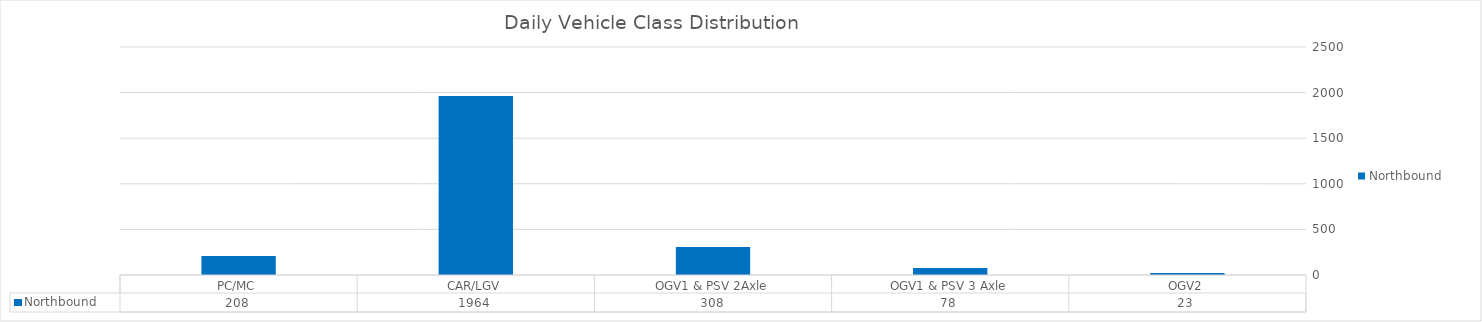
| Category | Northbound |
|---|---|
| PC/MC | 208 |
| CAR/LGV | 1964 |
| OGV1 & PSV 2Axle | 308 |
| OGV1 & PSV 3 Axle | 78 |
| OGV2 | 23 |